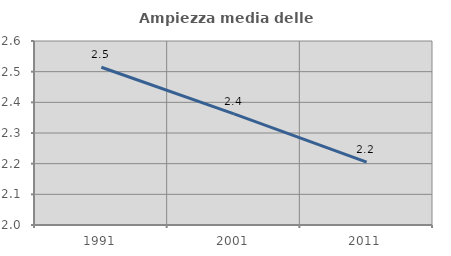
| Category | Ampiezza media delle famiglie |
|---|---|
| 1991.0 | 2.515 |
| 2001.0 | 2.362 |
| 2011.0 | 2.205 |